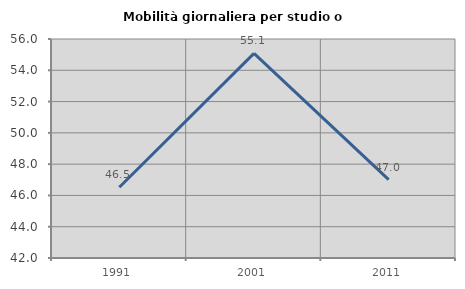
| Category | Mobilità giornaliera per studio o lavoro |
|---|---|
| 1991.0 | 46.521 |
| 2001.0 | 55.081 |
| 2011.0 | 47.012 |